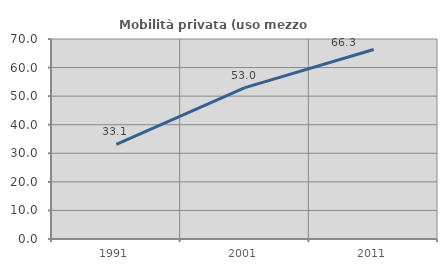
| Category | Mobilità privata (uso mezzo privato) |
|---|---|
| 1991.0 | 33.14 |
| 2001.0 | 52.985 |
| 2011.0 | 66.303 |